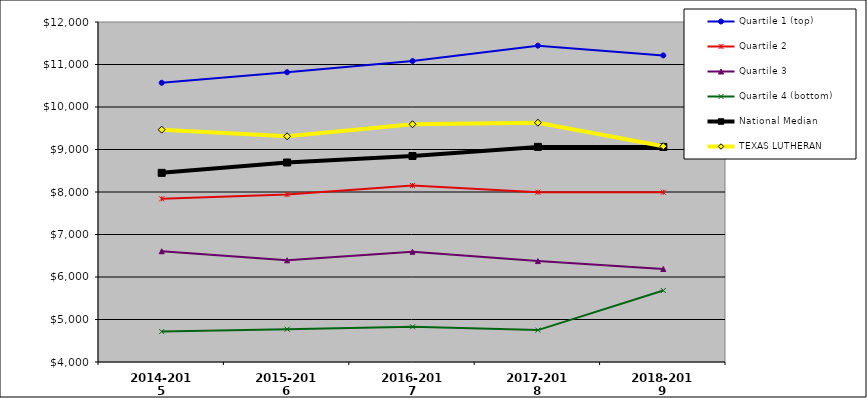
| Category | Quartile 1 (top) | Quartile 2 | Quartile 3 | Quartile 4 (bottom) | National Median | TEXAS LUTHERAN |
|---|---|---|---|---|---|---|
| 2014-2015 | 10570.192 | 7839.677 | 6605.481 | 4716.195 | 8450.558 | 9467.017 |
| 2015-2016 | 10818.223 | 7940.177 | 6392.994 | 4772.044 | 8693.909 | 9310.984 |
| 2016-2017 | 11080.93 | 8152.735 | 6594.03 | 4827.506 | 8846.742 | 9594.193 |
| 2017-2018 | 11443.66 | 7995.285 | 6373.746 | 4750.988 | 9061.41 | 9631.144 |
| 2018-2019 | 11213.714 | 7995.144 | 6188.153 | 5682.023 | 9059.978 | 9075.626 |